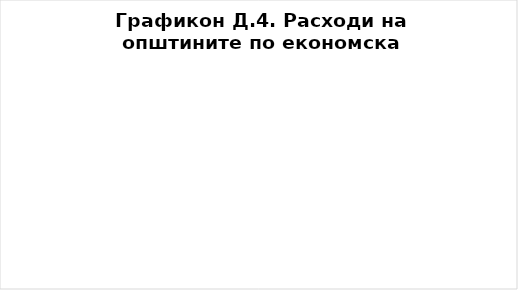
| Category | Износ |
|---|---|
| Плати и надоместоци | 255500000 |
| Резерви и недефинирани расходи | 1000000 |
| Стоки и услуги | 87525000 |
| Тековни трансфери до ЕЛС | 7500000 |
| Каматни плаќања | 400000 |
| Субвенции и трансфери | 0 |
| Социјални бенефиции | 0 |
| Капитални расходи | 44500000 |
| Отплата на главнина | 0 |